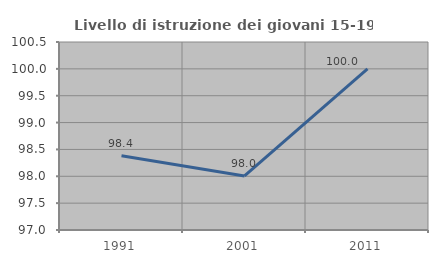
| Category | Livello di istruzione dei giovani 15-19 anni |
|---|---|
| 1991.0 | 98.384 |
| 2001.0 | 98.007 |
| 2011.0 | 100 |